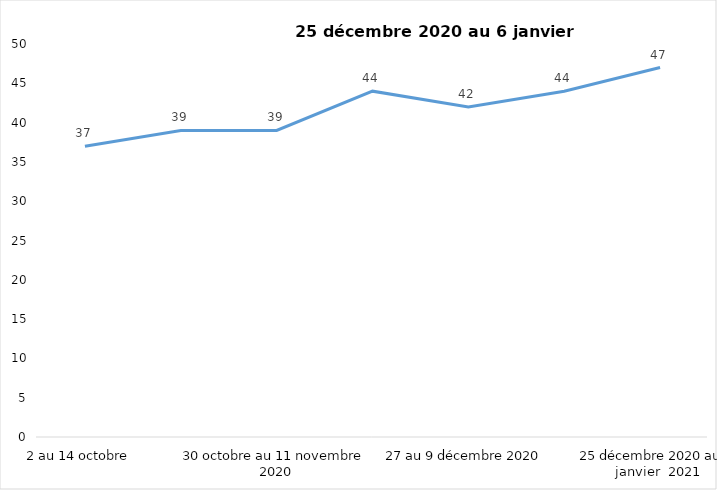
| Category | Toujours aux trois mesures |
|---|---|
| 2 au 14 octobre  | 37 |
| 16 au 28 octobre 2020 | 39 |
| 30 octobre au 11 novembre 2020 | 39 |
| 13 au 25 novembre 2020 | 44 |
| 27 au 9 décembre 2020 | 42 |
| 11 au 25 décembre 2020 | 44 |
| 25 décembre 2020 au 6 janvier  2021 | 47 |